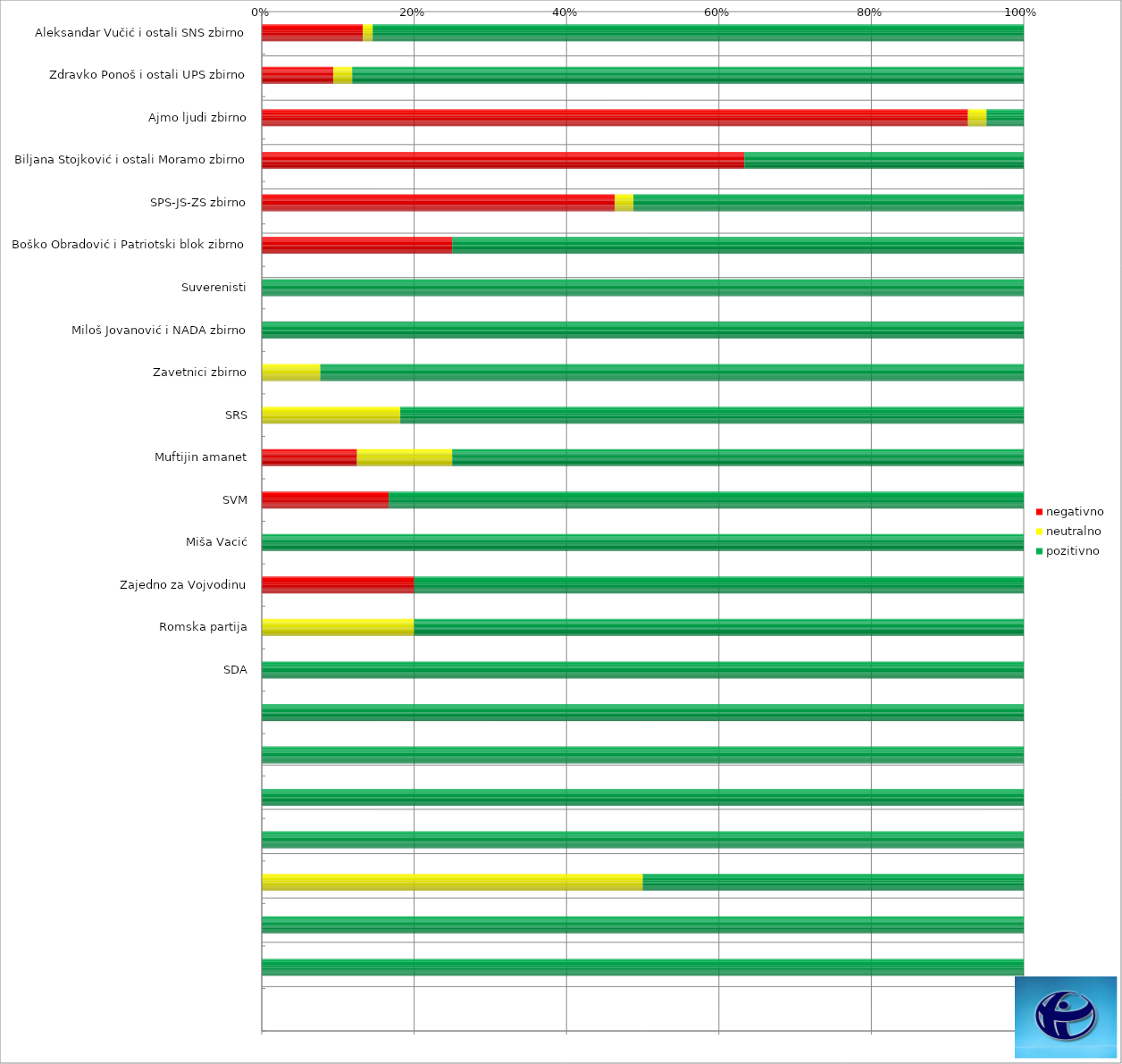
| Category | negativno | neutralno | pozitivno |
|---|---|---|---|
| Aleksandar Vučić i ostali SNS zbirno | 41 | 4 | 264 |
| Zdravko Ponoš i ostali UPS zbirno | 15 | 4 | 141 |
| Ajmo ljudi zbirno | 38 | 1 | 2 |
| Biljana Stojković i ostali Moramo zbirno | 19 | 0 | 11 |
| SPS-JS-ZS zbirno | 19 | 1 | 21 |
| Boško Obradović i Patriotski blok zibrno | 3 | 0 | 9 |
| Suverenisti | 0 | 0 | 9 |
| Miloš Jovanović i NADA zbirno | 0 | 0 | 7 |
| Zavetnici zbirno | 0 | 1 | 12 |
| SRS | 0 | 2 | 9 |
| Muftijin amanet | 1 | 1 | 6 |
| SVM | 1 | 0 | 5 |
| Miša Vacić | 0 | 0 | 1 |
| Zajedno za Vojvodinu | 1 | 0 | 4 |
| Romska partija | 0 | 1 | 4 |
| SDA | 0 | 0 | 1 |